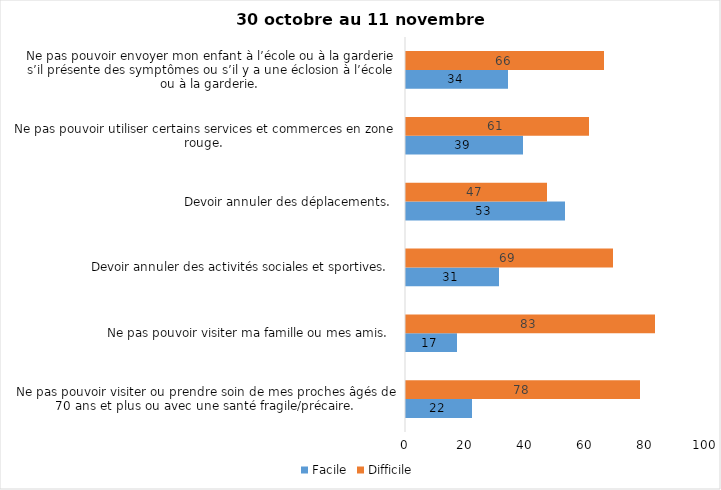
| Category | Facile | Difficile |
|---|---|---|
| Ne pas pouvoir visiter ou prendre soin de mes proches âgés de 70 ans et plus ou avec une santé fragile/précaire.  | 22 | 78 |
| Ne pas pouvoir visiter ma famille ou mes amis.  | 17 | 83 |
| Devoir annuler des activités sociales et sportives.  | 31 | 69 |
| Devoir annuler des déplacements.  | 53 | 47 |
| Ne pas pouvoir utiliser certains services et commerces en zone rouge.  | 39 | 61 |
| Ne pas pouvoir envoyer mon enfant à l’école ou à la garderie s’il présente des symptômes ou s’il y a une éclosion à l’école ou à la garderie.  | 34 | 66 |